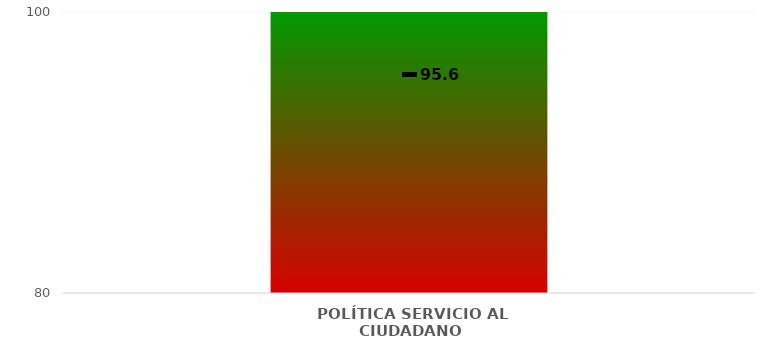
| Category | Niveles |
|---|---|
| POLÍTICA SERVICIO AL CIUDADANO | 100 |